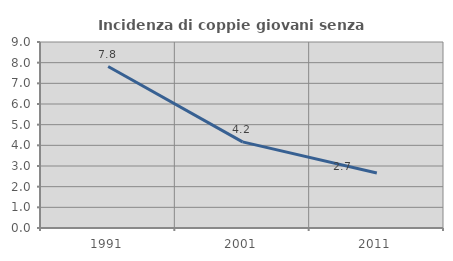
| Category | Incidenza di coppie giovani senza figli |
|---|---|
| 1991.0 | 7.812 |
| 2001.0 | 4.167 |
| 2011.0 | 2.66 |